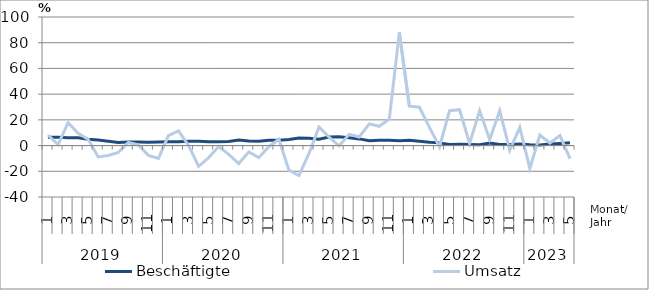
| Category | Beschäftigte | Umsatz |
|---|---|---|
| 0 | 6.4 | 8.2 |
| 1 | 6.5 | 0.6 |
| 2 | 6 | 17.8 |
| 3 | 6.1 | 9.6 |
| 4 | 4.9 | 4.9 |
| 5 | 4.3 | -8.8 |
| 6 | 3.3 | -7.7 |
| 7 | 2.4 | -5.4 |
| 8 | 2.8 | 2.4 |
| 9 | 2.7 | 0.5 |
| 10 | 2.5 | -7.6 |
| 11 | 2.7 | -10 |
| 12 | 2.9 | 7.8 |
| 13 | 2.9 | 11.5 |
| 14 | 3.4 | 0.1 |
| 15 | 3.4 | -16.1 |
| 16 | 2.9 | -9.5 |
| 17 | 2.9 | -0.8 |
| 18 | 3.1 | -6.9 |
| 19 | 4.3 | -14 |
| 20 | 3.6 | -4.9 |
| 21 | 3.4 | -9.4 |
| 22 | 4.1 | -0.9 |
| 23 | 4.1 | 4.9 |
| 24 | 4.8 | -19.1 |
| 25 | 5.8 | -23.3 |
| 26 | 5.6 | -6.1 |
| 27 | 5 | 14.4 |
| 28 | 6.6 | 6.6 |
| 29 | 6.9 | -0.3 |
| 30 | 6 | 8.7 |
| 31 | 5.2 | 6.7 |
| 32 | 3.8 | 16.9 |
| 33 | 4.2 | 15 |
| 34 | 4.2 | 20.6 |
| 35 | 3.7 | 88.1 |
| 36 | 4.1 | 30.7 |
| 37 | 3.4 | 29.8 |
| 38 | 2.6 | 14.1 |
| 39 | 2.1 | -1.1 |
| 40 | 0.9 | 27.1 |
| 41 | 1 | 27.9 |
| 42 | 0.8 | 1.7 |
| 43 | 0.7 | 27 |
| 44 | 2 | 4.7 |
| 45 | 0.9 | 27.1 |
| 46 | 0.9 | -3.5 |
| 47 | 1.2 | 14.1 |
| 48 | 0.6 | -17.8 |
| 49 | 0.5 | 8.2 |
| 50 | 1.2 | 2 |
| 51 | 1.7 | 7.8 |
| 52 | 2.1 | -10.2 |